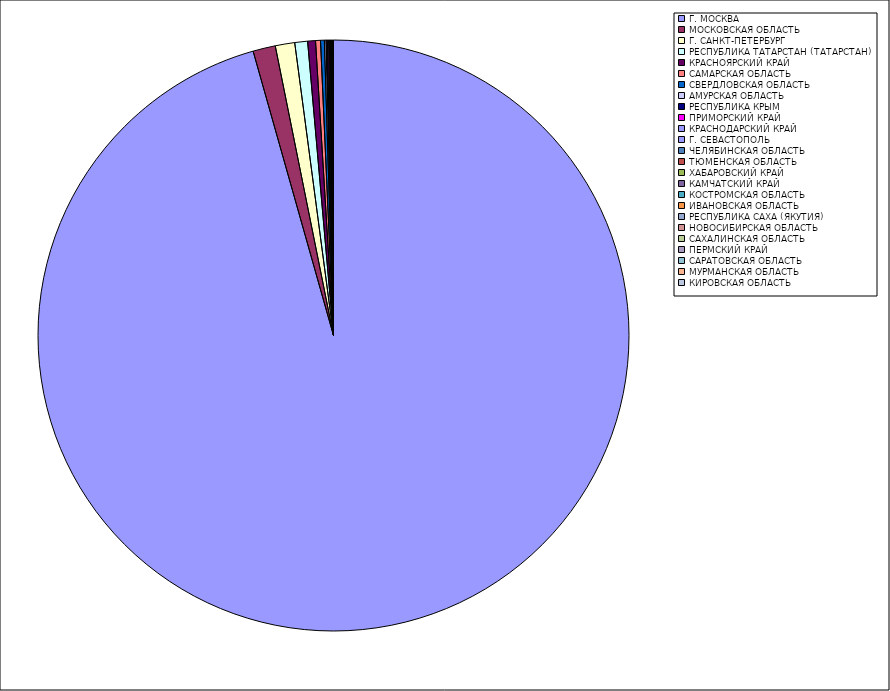
| Category | Оборот |
|---|---|
| Г. МОСКВА | 95.568 |
| МОСКОВСКАЯ ОБЛАСТЬ | 1.226 |
| Г. САНКТ-ПЕТЕРБУРГ | 1.063 |
| РЕСПУБЛИКА ТАТАРСТАН (ТАТАРСТАН) | 0.699 |
| КРАСНОЯРСКИЙ КРАЙ | 0.427 |
| САМАРСКАЯ ОБЛАСТЬ | 0.269 |
| СВЕРДЛОВСКАЯ ОБЛАСТЬ | 0.208 |
| АМУРСКАЯ ОБЛАСТЬ | 0.09 |
| РЕСПУБЛИКА КРЫМ | 0.07 |
| ПРИМОРСКИЙ КРАЙ | 0.069 |
| КРАСНОДАРСКИЙ КРАЙ | 0.05 |
| Г. СЕВАСТОПОЛЬ | 0.036 |
| ЧЕЛЯБИНСКАЯ ОБЛАСТЬ | 0.034 |
| ТЮМЕНСКАЯ ОБЛАСТЬ | 0.032 |
| ХАБАРОВСКИЙ КРАЙ | 0.017 |
| КАМЧАТСКИЙ КРАЙ | 0.013 |
| КОСТРОМСКАЯ ОБЛАСТЬ | 0.012 |
| ИВАНОВСКАЯ ОБЛАСТЬ | 0.012 |
| РЕСПУБЛИКА САХА (ЯКУТИЯ) | 0.011 |
| НОВОСИБИРСКАЯ ОБЛАСТЬ | 0.01 |
| САХАЛИНСКАЯ ОБЛАСТЬ | 0.009 |
| ПЕРМСКИЙ КРАЙ | 0.009 |
| САРАТОВСКАЯ ОБЛАСТЬ | 0.007 |
| МУРМАНСКАЯ ОБЛАСТЬ | 0.006 |
| КИРОВСКАЯ ОБЛАСТЬ | 0.005 |